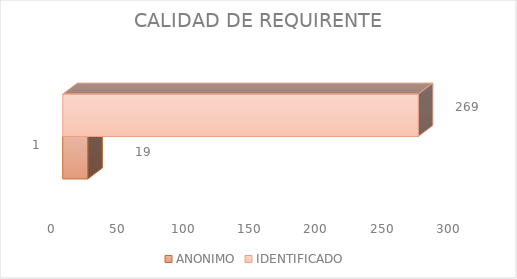
| Category | ANONIMO | IDENTIFICADO  |
|---|---|---|
| 0 | 19 | 269 |